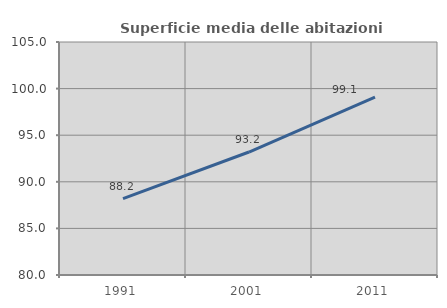
| Category | Superficie media delle abitazioni occupate |
|---|---|
| 1991.0 | 88.204 |
| 2001.0 | 93.197 |
| 2011.0 | 99.095 |